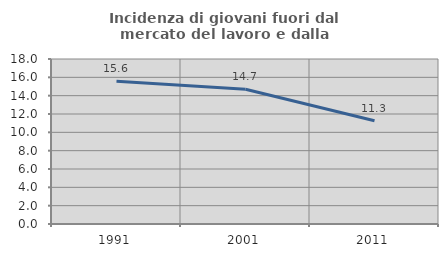
| Category | Incidenza di giovani fuori dal mercato del lavoro e dalla formazione  |
|---|---|
| 1991.0 | 15.586 |
| 2001.0 | 14.701 |
| 2011.0 | 11.262 |